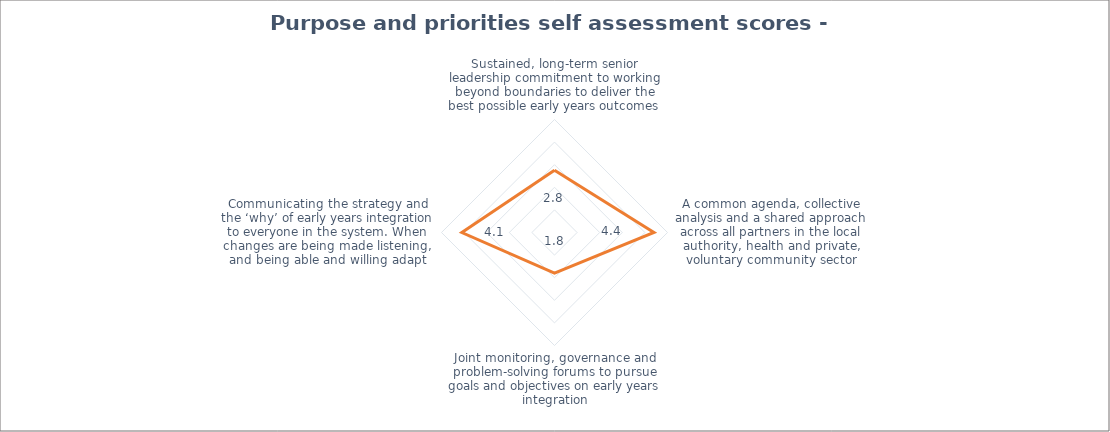
| Category | Series 0 |
|---|---|
| Sustained, long-term senior leadership commitment to working beyond boundaries to deliver the best possible early years outcomes | 2.75 |
| A common agenda, collective analysis and a shared approach across all partners in the local authority, health and private, voluntary community sector | 4.4 |
| Joint monitoring, governance and problem-solving forums to pursue goals and objectives on early years integration | 1.8 |
| Communicating the strategy and the ‘why’ of early years integration to everyone in the system. When changes are being made listening, and being able and willing adapt | 4.1 |